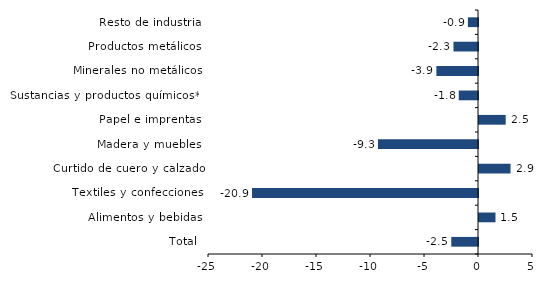
| Category | Series 0 |
|---|---|
| Total | -2.475 |
| Alimentos y bebidas | 1.527 |
| Textiles y confecciones | -20.925 |
| Curtido de cuero y calzado | 2.92 |
| Madera y muebles | -9.264 |
| Papel e imprentas | 2.471 |
| Sustancias y productos químicos** | -1.782 |
| Minerales no metálicos | -3.852 |
| Productos metálicos | -2.27 |
| Resto de industria | -0.937 |